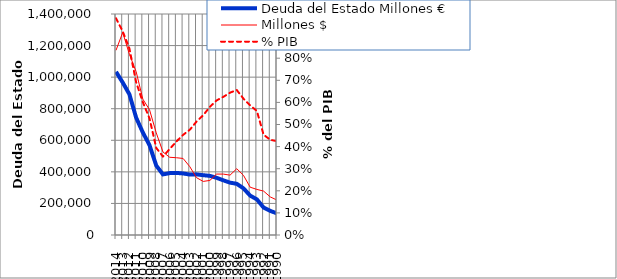
| Category | Deuda del Estado Millones € | Millones $ |
|---|---|---|
| 2014.0 | 1033958 | 1169912.687 |
| 2013.0 | 966181 | 1283185 |
| 2012.0 | 890993 | 1144748 |
| 2011.0 | 743531 | 1034995 |
| 2010.0 | 649259 | 860723 |
| 2009.0 | 568700 | 793223 |
| 2008.0 | 439771 | 646815 |
| 2007.0 | 383798 | 525995 |
| 2006.0 | 392168 | 492406 |
| 2005.0 | 393479 | 489527 |
| 2004.0 | 389888 | 484982 |
| 2003.0 | 382775 | 432995 |
| 2002.0 | 384145 | 363248 |
| 2001.0 | 378883 | 339328 |
| 2000.0 | 374557 | 345941 |
| 1999.0 | 362223 | 385947 |
| 1998.0 | 346417 | 385812 |
| 1997.0 | 331630 | 379124 |
| 1996.0 | 324301 | 419958 |
| 1995.0 | 295604 | 378071 |
| 1994.0 | 249508 | 302820 |
| 1993.0 | 225627 | 288807 |
| 1992.0 | 174047 | 278065 |
| 1991.0 | 152672 | 241298 |
| 1990.0 | 136775 | 221056 |